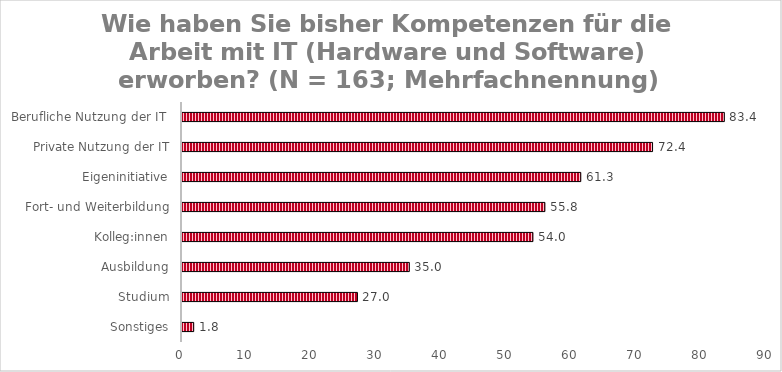
| Category | Series 0 |
|---|---|
| Sonstiges | 1.8 |
| Studium | 26.994 |
| Ausbildung | 34.969 |
| Kolleg:innen | 53.988 |
| Fort- und Weiterbildung | 55.828 |
| Eigeninitiative | 61.35 |
| Private Nutzung der IT | 72.393 |
| Berufliche Nutzung der IT  | 83.436 |